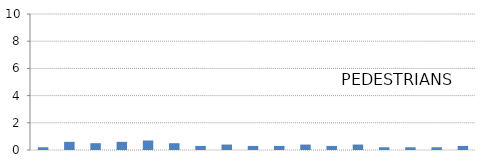
| Category | PEDESTRIANS |
|---|---|
| 0-4  | 0.2 |
| 5-9 | 0.6 |
| 10-14 | 0.5 |
| 15-19  | 0.6 |
| 20-24  | 0.7 |
| 25-29  | 0.5 |
| 30-34  | 0.3 |
| 35-39  | 0.4 |
| 40-44  | 0.3 |
| 45-49  | 0.3 |
| 50-54  | 0.4 |
| 55-59  | 0.3 |
| 60-64  | 0.4 |
| 65-69  | 0.2 |
| 70-74  | 0.2 |
| 75-79  | 0.2 |
| 80+ | 0.3 |